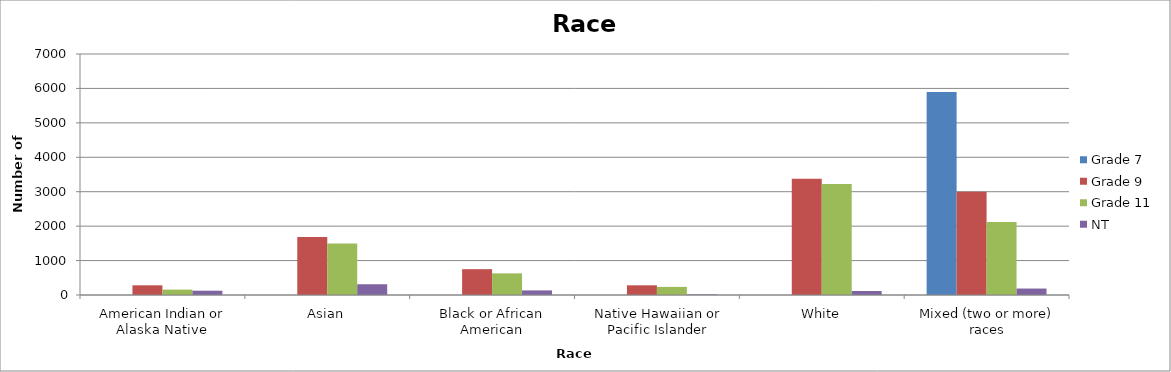
| Category | Grade 7 | Grade 9 | Grade 11 | NT |
|---|---|---|---|---|
| American Indian or Alaska Native | 0 | 281.37 | 157.14 | 125.02 |
| Asian | 0 | 1688.22 | 1492.83 | 312.55 |
| Black or African American | 0 | 750.32 | 628.56 | 133.95 |
| Native Hawaiian or Pacific Islander | 0 | 281.37 | 235.71 | 17.86 |
| White | 0 | 3376.44 | 3221.37 | 116.09 |
| Mixed (two or more) races | 5893 | 3001.28 | 2121.39 | 187.53 |